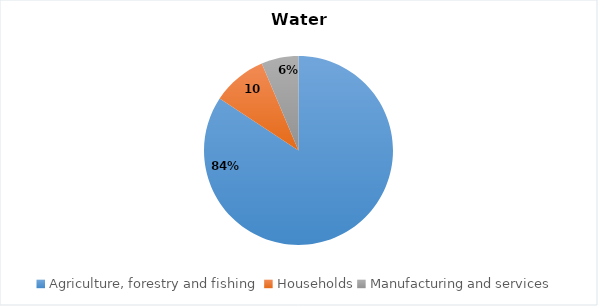
| Category | Series 1 |
|---|---|
| Agriculture, forestry and fishing | 502.423 |
| Households | 55.819 |
| Manufacturing and services | 37.838 |